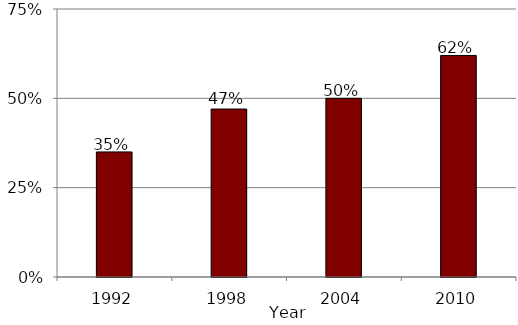
| Category | Series 0 |
|---|---|
| 1992.0 | 0.35 |
| 1998.0 | 0.47 |
| 2004.0 | 0.5 |
| 2010.0 | 0.62 |